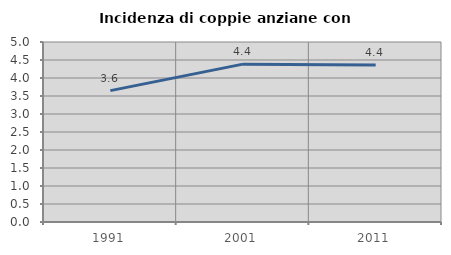
| Category | Incidenza di coppie anziane con figli |
|---|---|
| 1991.0 | 3.649 |
| 2001.0 | 4.385 |
| 2011.0 | 4.361 |